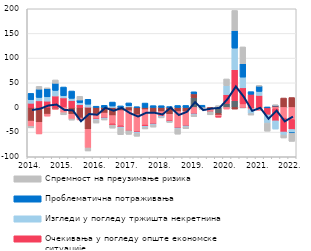
| Category | Други фактори | Трошкови извора за кредите | Конкуренција осталих банака | Очекивања у погледу опште економске ситуације | Изгледи у погледу тржишта некретнина | Проблематична потраживања | Спремност на преузимање ризика |
|---|---|---|---|---|---|---|---|
| 2014. | 0.064 | -27.614 | -10.883 | 8.513 | 7.366 | 12.572 | -2.931 |
|  | 0 | -30.154 | -23.565 | 13.381 | 6.958 | 16.79 | 5.591 |
|  | 0 | -13.58 | -4.04 | 12.84 | 8.698 | 16.68 | 1.322 |
|  | 0 | -3.194 | -0.943 | 23.215 | 11.346 | 14.413 | 6.815 |
| 2015. | 0 | 1.584 | -10.634 | 17.798 | 4.391 | 17.665 | -4.309 |
|  | 0 | -13.709 | -9.748 | 14.011 | 4.433 | 14.906 | -2.291 |
|  | 0 | -21.32 | -4.036 | 5.521 | 4.364 | 5.262 | 7.435 |
|  | 0 | -44.371 | -37.787 | 0.672 | 5.886 | 9.984 | -6.068 |
| 2016. | 0 | -13.683 | -9.865 | -0.183 | -2.017 | 2.537 | -5.896 |
|  | 0 | -11.339 | -9.602 | -0.197 | -1.974 | 4.34 | -2.332 |
|  | 0 | -16.54 | -16.708 | -2.652 | 2.885 | 8.061 | -6.073 |
|  | 0 | -6.439 | -30.804 | -2.596 | -1.957 | 3.101 | -13.396 |
| 2017. | 1.137 | -6.563 | -40.484 | -0.096 | 2.394 | 5.669 | -7.434 |
|  | 0 | -14.708 | -34.121 | -1.211 | -2.234 | 1.309 | -6.144 |
|  | 0 | -4.365 | -31.359 | -2.483 | -2.033 | 8.902 | -3.307 |
|  | 0 | -9.63 | -23.589 | -0.294 | -2.083 | 3.686 | -4.267 |
| 2018. | 0 | -8.401 | -9.465 | -0.308 | -2.087 | 3.545 | -0.758 |
|  | 0 | -13.817 | -13.719 | -0.384 | -1.143 | 1.627 | -1.188 |
|  | 0 | -8.391 | -32.723 | -0.405 | -2.001 | 3.96 | -10.656 |
|  | 0 | -8.386 | -28.581 | -0.415 | -2.043 | 4.097 | -3.682 |
| 2019. | 19.953 | 7.614 | -12.529 | -0.41 | -2.062 | 4.174 | -3.764 |
|  | 0 | -0.003 | 0 | -0.494 | 0 | 4.55 | -3.594 |
|  | 0 | -3.529 | -4.583 | -0.546 | 0 | 0 | -6.275 |
|  | -12.056 | -3.387 | -3.387 | -0.556 | 0 | 0 | 3.746 |
| 2020. | 8.2 | 0 | -3.3 | 17.776 | 18.324 | 0 | 13.5 |
|  | 13.5 | -3.3 | 0 | 63.053 | 43.711 | 35.524 | 40.8 |
|  | -0.7 | 0 | 7.2 | 32.599 | 21.695 | 27.071 | 34.2 |
|  | -0.411 | -0.778 | -3.063 | 26.746 | -8.12 | 5.298 | -3.047 |
| 2021. | -0.834 | 0 | -5.032 | 24.468 | 7.975 | 11.008 | 0.658 |
|  | 0 | 0 | 0 | -15.124 | -16.532 | 0.072 | -16.532 |
|  | 0 | 2.953 | -2.953 | -24.203 | -16.663 | 1.353 | 0.892 |
|  | 0 | 19.115 | -21.697 | -28.046 | -6.07 | 0 | -6.07 |
| 2022. | 0 | 20.1 | -24.6 | -20.1 | -6 | -1.3 | -16.8 |